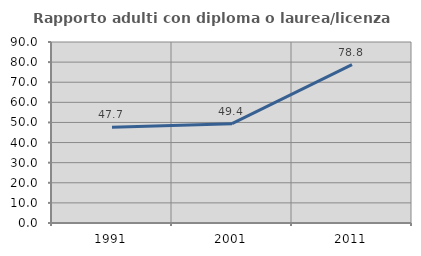
| Category | Rapporto adulti con diploma o laurea/licenza media  |
|---|---|
| 1991.0 | 47.664 |
| 2001.0 | 49.375 |
| 2011.0 | 78.788 |